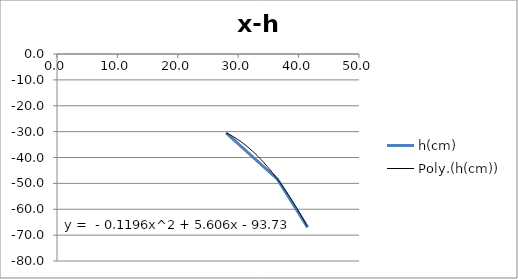
| Category | h(cm) |
|---|---|
| 28.0 | -30.5 |
| 36.5 | -48.4 |
| 41.5 | -67 |